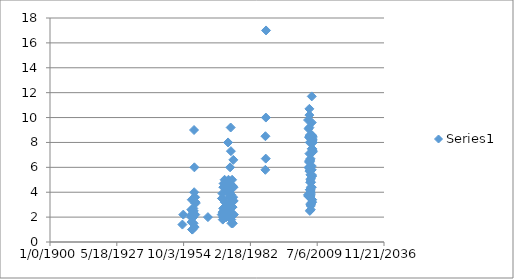
| Category | Series 0 |
|---|---|
| 19820.0 | 1.4 |
| 19953.0 | 2.2 |
| 21103.0 | 2.1 |
| 21136.0 | 2 |
| 21159.0 | 2.6 |
| 21187.0 | 1.6 |
| 21222.0 | 3.4 |
| 21249.0 | 2.2 |
| 21283.0 | 1 |
| 21311.0 | 1 |
| 21340.0 | 2.3 |
| 21382.0 | 2.5 |
| 21398.0 | 2 |
| 21447.0 | 2 |
| 21460.0 | 2.7 |
| 21495.0 | 1.5 |
| 21527.0 | 2.5 |
| 21557.0 | 9 |
| 21584.0 | 4 |
| 21614.0 | 6 |
| 21656.0 | 1.2 |
| 21682.0 | 3.6 |
| 21705.0 | 3.6 |
| 21745.0 | 2.2 |
| 21767.0 | 3.1 |
| 21794.0 | 3.2 |
| 23637.0 | 2 |
| 25709.0 | 2.2 |
| 25742.0 | 3.5 |
| 25773.0 | 3.5 |
| 25804.0 | 3.9 |
| 25833.0 | 2.4 |
| 25868.0 | 1.8 |
| 25897.0 | 2 |
| 25923.0 | 2.7 |
| 25954.0 | 4.4 |
| 25987.0 | 4.7 |
| 26022.0 | 4.4 |
| 26050.0 | 2 |
| 26071.0 | 2.3 |
| 26113.0 | 4.7 |
| 26135.0 | 5 |
| 26150.0 | 2.5 |
| 26177.0 | 2.5 |
| 26197.0 | 3.2 |
| 26226.0 | 3.2 |
| 26254.0 | 2.5 |
| 26289.0 | 2.5 |
| 26317.0 | 2.8 |
| 26385.0 | 2.4 |
| 26413.0 | 2 |
| 26442.0 | 2.5 |
| 26500.0 | 4 |
| 26535.0 | 4.5 |
| 26563.0 | 4.8 |
| 26597.0 | 4.2 |
| 26624.0 | 2.1 |
| 26655.0 | 8 |
| 26689.0 | 2.6 |
| 26718.0 | 5 |
| 26745.0 | 3 |
| 26760.0 | 2 |
| 26773.0 | 2.4 |
| 26806.0 | 2.6 |
| 26826.0 | 2.1 |
| 26869.0 | 3.6 |
| 26899.0 | 4 |
| 26927.0 | 4.5 |
| 26961.0 | 6 |
| 26987.0 | 3.6 |
| 27016.0 | 2.4 |
| 27051.0 | 9.2 |
| 27080.0 | 7.3 |
| 27109.0 | 3.8 |
| 27136.0 | 1.8 |
| 27165.0 | 1.5 |
| 27207.0 | 3.2 |
| 27233.0 | 3.3 |
| 27263.0 | 5 |
| 27290.0 | 2.8 |
| 27318.0 | 2.8 |
| 27353.0 | 4.5 |
| 27373.0 | 1.5 |
| 27423.0 | 3.6 |
| 27444.0 | 6.6 |
| 27473.0 | 4.4 |
| 27501.0 | 3.3 |
| 27528.0 | 2.2 |
| 32237.0 | 5.8 |
| 32253.0 | 8.5 |
| 32300.0 | 6.7 |
| 32316.0 | 10 |
| 32342.0 | 17 |
| 38630.0 | 9.8 |
| 38638.0 | 3.8 |
| 38651.0 | 3.7 |
| 38687.0 | 3.7 |
| 38716.0 | 9.1 |
| 38741.0 | 6 |
| 38771.0 | 6.5 |
| 38798.0 | 8.4 |
| 38826.0 | 6.4 |
| 38830.0 | 9.2 |
| 38830.0 | 10.7 |
| 38830.0 | 10.2 |
| 38830.0 | 8.5 |
| 38831.0 | 5.7 |
| 38836.0 | 6 |
| 38840.0 | 7.1 |
| 38862.0 | 5.9 |
| 38890.0 | 8 |
| 38894.0 | 5.9 |
| 38894.0 | 4.2 |
| 38894.0 | 3.7 |
| 38895.0 | 2.5 |
| 38923.0 | 8.6 |
| 38949.0 | 4.8 |
| 38949.0 | 4.2 |
| 38950.0 | 6.5 |
| 38958.0 | 6.6 |
| 38988.0 | 6.7 |
| 38989.0 | 5.4 |
| 38989.0 | 5 |
| 38990.0 | 4.2 |
| 38993.0 | 3.9 |
| 39018.0 | 3.8 |
| 39018.0 | 3.7 |
| 39018.0 | 3 |
| 39020.0 | 4.1 |
| 39021.0 | 4 |
| 39037.0 | 2.6 |
| 39038.0 | 2.9 |
| 39038.0 | 3 |
| 39038.0 | 3.1 |
| 39042.0 | 4.4 |
| 39049.0 | 5.1 |
| 39086.0 | 4.8 |
| 39114.0 | 5.8 |
| 39183.0 | 5.8 |
| 39187.0 | 8.6 |
| 39187.0 | 11.7 |
| 39188.0 | 9.6 |
| 39188.0 | 5.4 |
| 39189.0 | 6.1 |
| 39195.0 | 4.4 |
| 39210.0 | 7.5 |
| 39225.0 | 7.5 |
| 39238.0 | 8.3 |
| 39252.0 | 8.2 |
| 39252.0 | 7.2 |
| 39252.0 | 8.5 |
| 39253.0 | 7.4 |
| 39253.0 | 5.3 |
| 39253.0 | 3.2 |
| 39253.0 | 3.4 |
| 39273.0 | 8.4 |
| 39296.0 | 8.5 |
| 39336.0 | 8.2 |
| 39352.0 | 8 |
| 39365.0 | 7.3 |